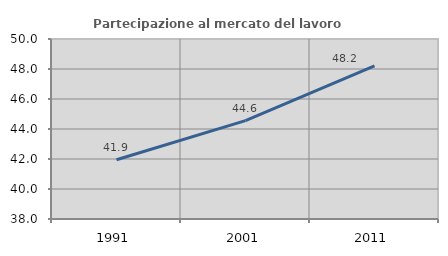
| Category | Partecipazione al mercato del lavoro  femminile |
|---|---|
| 1991.0 | 41.949 |
| 2001.0 | 44.561 |
| 2011.0 | 48.211 |